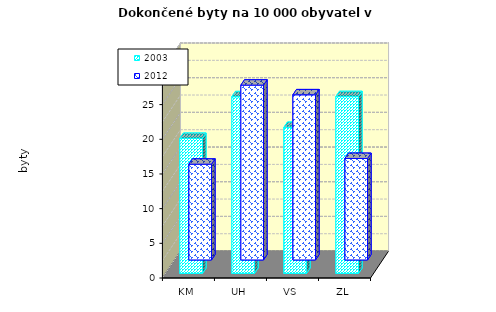
| Category | 2003 | 2012 |
|---|---|---|
| KM | 19.473 | 13.811 |
| UH | 25.479 | 25.21 |
| VS | 21.058 | 23.813 |
| ZL | 25.495 | 14.636 |